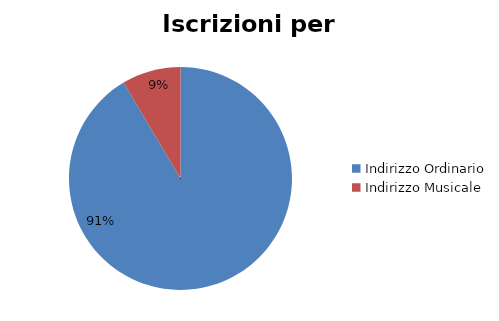
| Category | #REF! |
|---|---|
| Indirizzo Ordinario | 33999 |
| Indirizzo Musicale | 3169 |